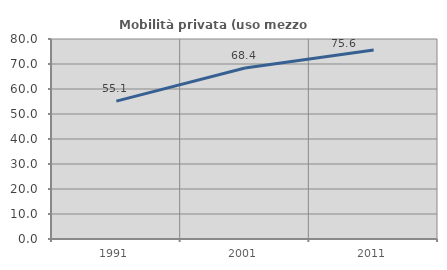
| Category | Mobilità privata (uso mezzo privato) |
|---|---|
| 1991.0 | 55.136 |
| 2001.0 | 68.388 |
| 2011.0 | 75.584 |